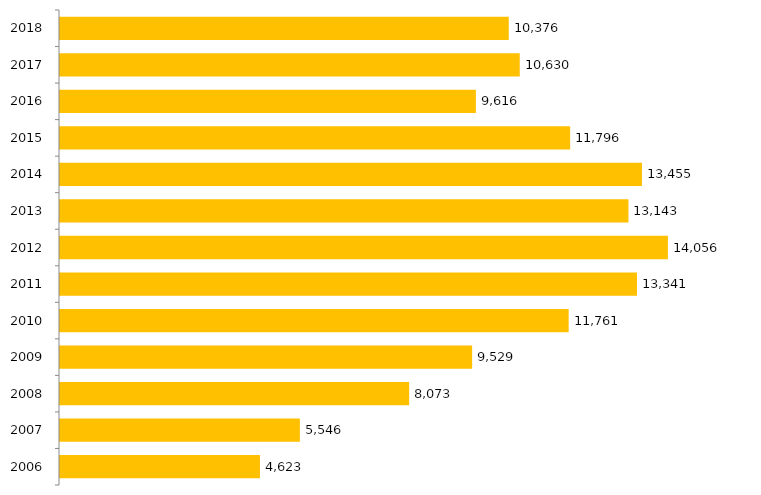
| Category | Inscritos |
|---|---|
| 2006.0 | 4623 |
| 2007.0 | 5546 |
| 2008.0 | 8073 |
| 2009.0 | 9529 |
| 2010.0 | 11761 |
| 2011.0 | 13341 |
| 2012.0 | 14056 |
| 2013.0 | 13143 |
| 2014.0 | 13455 |
| 2015.0 | 11796 |
| 2016.0 | 9616 |
| 2017.0 | 10630 |
| 2018.0 | 10376 |